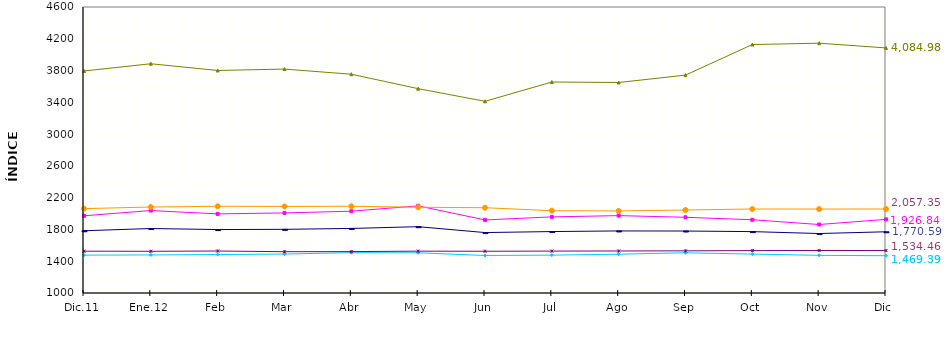
| Category | Series 0 | Series 1 | Series 2 | Series 3 | Series 4 | Series 5 |
|---|---|---|---|---|---|---|
| Dic.11 | 1783.47 | 1971.981 | 3794.458 | 1476.635 | 1526.339 | 2061.909 |
| Ene.12 | 1811.584 | 2037.761 | 3885.488 | 1479.123 | 1525.038 | 2082.196 |
| Feb | 1798.555 | 1995.807 | 3801.223 | 1483.927 | 1528.57 | 2091.595 |
| Mar | 1801.46 | 2007.927 | 3818.471 | 1490.358 | 1519.945 | 2089.529 |
| Abr | 1812.48 | 2029.589 | 3753.709 | 1507.599 | 1521.16 | 2091.929 |
| May | 1834.73 | 2096.932 | 3572.239 | 1505.88 | 1526.866 | 2079.245 |
| Jun | 1760.739 | 1919.816 | 3412.782 | 1471.885 | 1525.429 | 2073.662 |
| Jul | 1773.508 | 1958.182 | 3655.703 | 1476.906 | 1527.509 | 2035.883 |
| Ago | 1781.285 | 1974.145 | 3649.78 | 1488.502 | 1528.733 | 2032.809 |
| Sep | 1780.095 | 1953.181 | 3742.669 | 1506.104 | 1530.805 | 2044.607 |
| Oct | 1772.67 | 1922.006 | 4127.529 | 1490.041 | 1533.483 | 2057.317 |
| Nov | 1748.461 | 1862.217 | 4144.45 | 1473.808 | 1535.301 | 2056.479 |
| Dic | 1770.586 | 1926.842 | 4084.975 | 1469.393 | 1534.465 | 2057.352 |